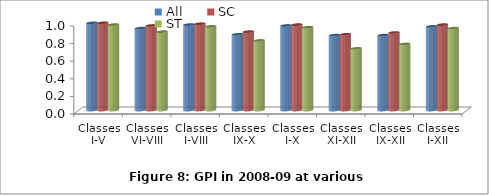
| Category | All | SC | ST |
|---|---|---|---|
| Classes
I-V | 0.99 | 0.99 | 0.97 |
| Classes
VI-VIII | 0.93 | 0.96 | 0.89 |
| Classes
I-VIII | 0.97 | 0.98 | 0.95 |
| Classes
IX-X | 0.86 | 0.89 | 0.79 |
| Classes
I-X | 0.96 | 0.97 | 0.94 |
| Classes
XI-XII | 0.85 | 0.86 | 0.7 |
| Classes
IX-XII | 0.85 | 0.88 | 0.75 |
| Classes
I-XII | 0.95 | 0.97 | 0.93 |